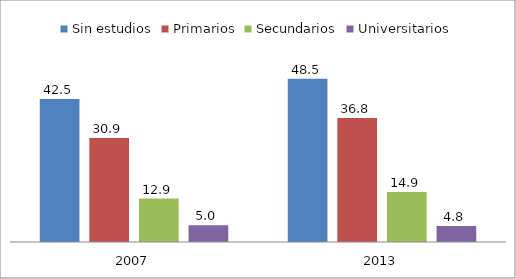
| Category | Sin estudios | Primarios | Secundarios | Universitarios |
|---|---|---|---|---|
| 2007 | 42.476 | 30.889 | 12.896 | 5.007 |
| 2013 | 48.469 | 36.841 | 14.853 | 4.759 |